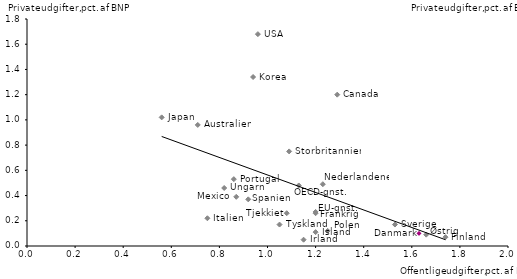
| Category | Series 0 |
|---|---|
| 0.96 | 1.68 |
| 1.29 | 1.2 |
| 0.94 | 1.34 |
| 1.09 | 0.75 |
| 1.74 | 0.07 |
| 1.66 | 0.09 |
| 1.63 | 0.1 |
| 1.23 | 0.49 |
| 1.53 | 0.17 |
| 0.71 | 0.96 |
| 1.13 | 0.48 |
| 0.56 | 1.02 |
| 1.2 | 0.27 |
| 1.2 | 0.26 |
| 0.86 | 0.53 |
| 1.25 | 0.12 |
| 1.08 | 0.26 |
| 1.2 | 0.11 |
| 0.82 | 0.46 |
| 0.92 | 0.37 |
| 0.87 | 0.39 |
| 1.05 | 0.17 |
| 1.15 | 0.05 |
| 0.75 | 0.22 |